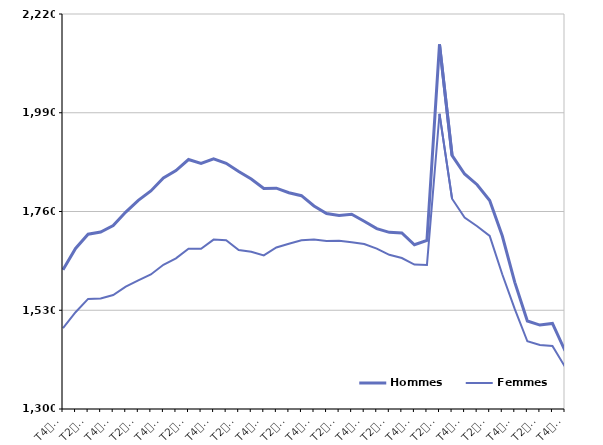
| Category | Hommes  | Femmes  |
|---|---|---|
| T4
2012 | 1624.1 | 1488.1 |
| T1
2013 | 1673.9 | 1525.4 |
| T2
2013 | 1707.2 | 1556.4 |
| T3
2013 | 1712.3 | 1557.2 |
| T4
2013 | 1727.2 | 1565.4 |
| T1
2014 | 1758.7 | 1585.2 |
| T2
2014 | 1786.1 | 1599.6 |
| T3
2014 | 1807.8 | 1613.3 |
| T4
2014 | 1837.9 | 1635.9 |
| T1
2015 | 1855.4 | 1650.9 |
| T2
2015 | 1881 | 1673.1 |
| T3
2015 | 1871.8 | 1673.3 |
| T4
2015 | 1882.8 | 1694.5 |
| T1
2016 | 1872.4 | 1693.1 |
| T2
2016 | 1853.1 | 1670.3 |
| T3
2016 | 1835.7 | 1666.3 |
| T4
2016 | 1813.5 | 1657.8 |
| T1
2017 | 1814.3 | 1676.2 |
| T2
2017 | 1803.6 | 1684.9 |
| T3
2017 | 1796.8 | 1692.9 |
| T4
2017 | 1772.9 | 1695 |
| T1
2018 | 1755.2 | 1691.3 |
| T2
2018 | 1750.5 | 1691.6 |
| T3
2018 | 1753.7 | 1688.5 |
| T4
2018 | 1737.2 | 1684.4 |
| T1
2019 | 1720.2 | 1673.5 |
| T2
2019 | 1711.4 | 1659.1 |
| T3
2019 | 1710.2 | 1651.7 |
| T4
2019 | 1682.6 | 1636.4 |
| T1
2020 | 1692.9 | 1635.6 |
| T2
2020 | 2149.2 | 1987.6 |
| T3
2020 | 1890.7 | 1789.8 |
| T4
2020 | 1847.4 | 1745.9 |
| T1
2021 | 1822.4 | 1725.6 |
| T2
2021 | 1785.7 | 1703.2 |
| T3
2021 | 1703.4 | 1613.9 |
| T4
2021 | 1595 | 1532.5 |
| T1
2022 | 1505.1 | 1457.7 |
| T2
2022 | 1495.5 | 1449.2 |
| T3
2022 | 1499.2 | 1446.9 |
| T4
2022 | 1435.7 | 1398.3 |